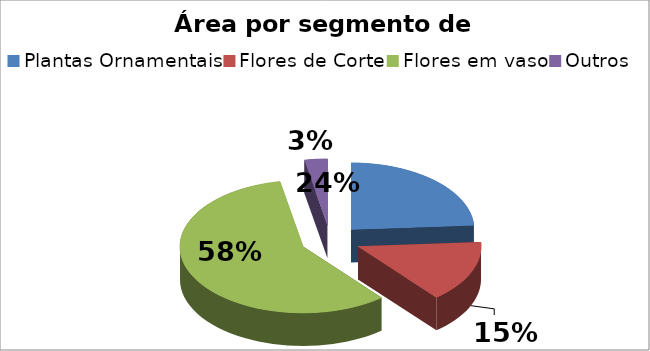
| Category | Series 0 |
|---|---|
| Plantas Ornamentais | 0.24 |
| Flores de Corte | 0.15 |
| Flores em vaso | 0.58 |
| Outros | 0.03 |